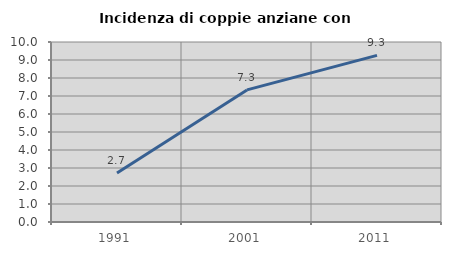
| Category | Incidenza di coppie anziane con figli |
|---|---|
| 1991.0 | 2.727 |
| 2001.0 | 7.339 |
| 2011.0 | 9.259 |